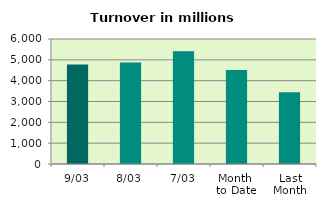
| Category | Series 0 |
|---|---|
| 9/03 | 4770.328 |
| 8/03 | 4869.252 |
| 7/03 | 5412.672 |
| Month 
to Date | 4516.487 |
| Last
Month | 3445.759 |